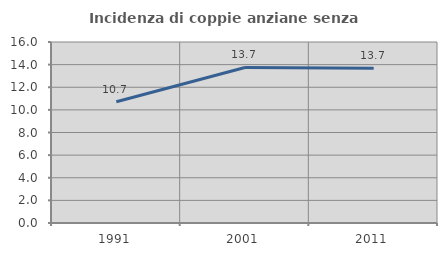
| Category | Incidenza di coppie anziane senza figli  |
|---|---|
| 1991.0 | 10.724 |
| 2001.0 | 13.748 |
| 2011.0 | 13.684 |